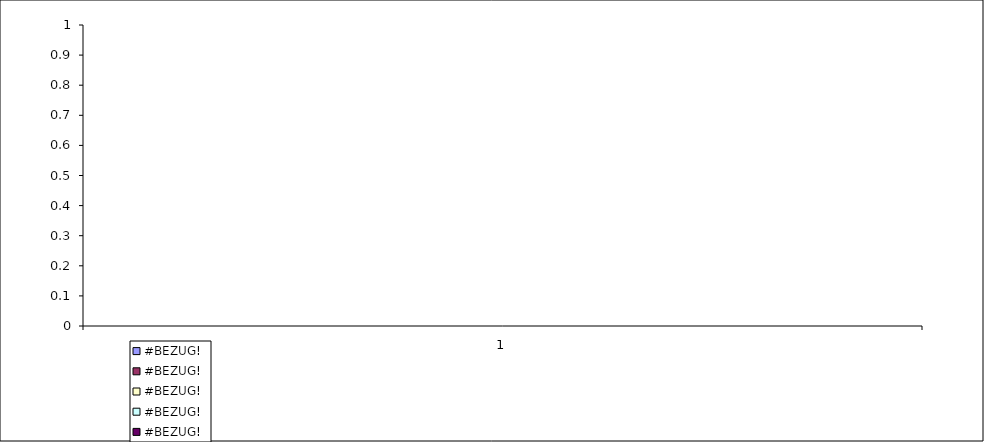
| Category | #BEZUG! |
|---|---|
| 0.0 | 0 |